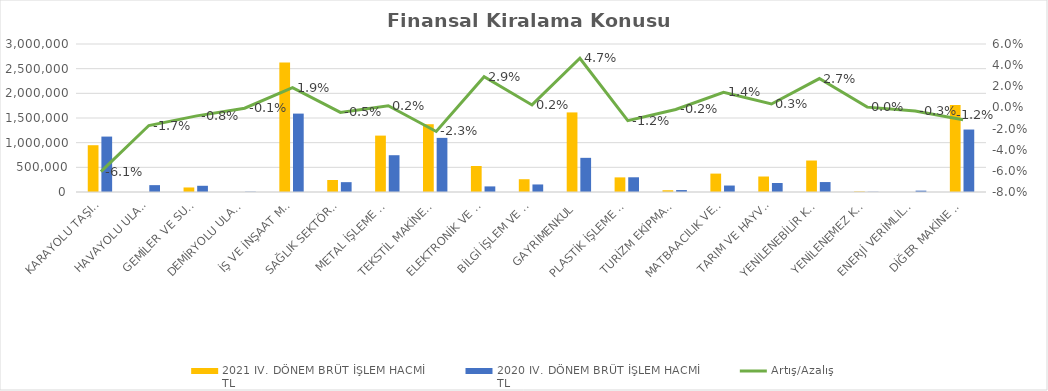
| Category | 2021 IV. DÖNEM BRÜT İŞLEM HACMİ 
TL | 2020 IV. DÖNEM BRÜT İŞLEM HACMİ 
TL |
|---|---|---|
| KARAYOLU TAŞITLARI | 948376.468 | 1123317.675 |
| HAVAYOLU ULAŞIM ARAÇLARI | 0 | 139248.447 |
| GEMİLER VE SUDA YÜZEN TAŞIT VE ARAÇLAR | 91835.524 | 126063.05 |
| DEMİRYOLU ULAŞIM ARAÇLARI | 0 | 5837.781 |
| İŞ VE İNŞAAT MAKİNELERİ | 2623130.981 | 1589194.856 |
| SAĞLIK SEKTÖRÜ VE ESTETİK EKİPMANLARI | 243321.652 | 199668.217 |
| METAL İŞLEME MAKİNELERİ | 1143085.516 | 745633.761 |
| TEKSTİL MAKİNELERİ | 1373907.98 | 1097088.6 |
| ELEKTRONİK VE OPTİK CİHAZLAR | 527645.198 | 113398.936 |
| BİLGİ İŞLEM VE BÜRO SİSTEMLERİ | 259140.056 | 152874.552 |
| GAYRİMENKUL | 1613184.13 | 692491.049 |
| PLASTİK İŞLEME MAKİNELERİ | 296276.19 | 298336.422 |
| TURİZM EKİPMANLARI | 35378.869 | 39334.502 |
| MATBAACILIK VE KAĞIT İŞLEME MAKİNELERİ | 372894.248 | 131032.291 |
| TARIM VE HAYVANCILIK MAKİNELERİ | 314023.297 | 181894.797 |
| YENİLENEBİLİR KAYNAKLI ELEKTRİK ENERJİSİ ÜRETİM EKİPMANLARI | 638030.274 | 201519.361 |
| YENİLENEMEZ KAYNAKLI ELEKTRİK ENERJİSİ ÜRETİM EKİPMANLARI | 9877.067 | 4265.228 |
| ENERJİ VERİMLİLİĞİ EKİPMANLARI | 465.715 | 27556.604 |
| DİĞER MAKİNE VE EKİPMANLAR | 1763245.955 | 1266087.105 |